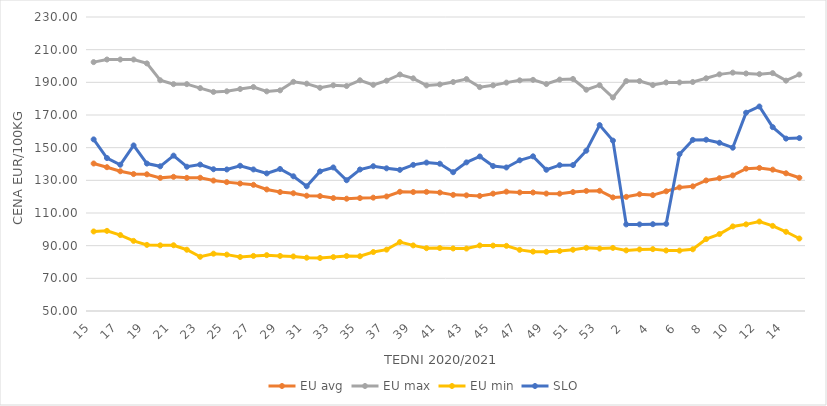
| Category | EU avg | EU max | EU min | SLO |
|---|---|---|---|---|
| 15.0 | 140.306 | 202.38 | 98.696 | 155.07 |
| 16.0 | 138.046 | 203.97 | 99.065 | 143.65 |
| 17.0 | 135.556 | 203.97 | 96.499 | 139.55 |
| 18.0 | 133.857 | 203.97 | 92.931 | 151.36 |
| 19.0 | 133.702 | 201.59 | 90.48 | 140.27 |
| 20.0 | 131.51 | 191.27 | 90.199 | 138.59 |
| 21.0 | 132.157 | 188.89 | 90.255 | 145.12 |
| 22.0 | 131.509 | 188.89 | 87.513 | 138.33 |
| 23.0 | 131.578 | 186.47 | 83.199 | 139.64 |
| 24.0 | 129.861 | 184.13 | 85.09 | 136.79 |
| 25.0 | 128.899 | 184.51 | 84.52 | 136.65 |
| 26.0 | 128.034 | 185.91 | 83.06 | 138.92 |
| 27.0 | 127.242 | 187.11 | 83.73 | 136.67 |
| 28.0 | 124.426 | 184.46 | 84.2 | 134.25 |
| 29.0 | 122.822 | 185.09 | 83.72 | 136.94 |
| 30.0 | 122.086 | 190.31 | 83.4 | 132.48 |
| 31.0 | 120.581 | 189.19 | 82.63 | 126.34 |
| 32.0 | 120.341 | 186.67 | 82.46 | 135.48 |
| 33.0 | 119.127 | 188.18 | 82.99 | 137.89 |
| 34.0 | 118.75 | 187.74 | 83.66 | 130.07 |
| 35.0 | 119.136 | 191.25 | 83.53 | 136.63 |
| 36.0 | 119.398 | 188.47 | 86.09 | 138.64 |
| 37.0 | 120.135 | 190.99 | 87.57 | 137.35 |
| 38.0 | 122.982 | 194.8 | 92.21 | 136.42 |
| 39.0 | 122.832 | 192.45 | 90.16 | 139.46 |
| 40.0 | 122.936 | 188.11 | 88.45 | 140.87 |
| 41.0 | 122.507 | 188.73 | 88.54 | 140.18 |
| 42.0 | 121.098 | 190.2 | 88.3 | 134.98 |
| 43.0 | 120.822 | 191.99 | 88.22 | 141 |
| 44.0 | 120.448 | 187.06 | 90.13 | 144.61 |
| 45.0 | 121.843 | 188.15 | 90.04 | 138.73 |
| 46.0 | 123.07 | 189.82 | 89.89 | 137.88 |
| 47.0 | 122.58 | 191.22 | 87.43 | 142.27 |
| 48.0 | 122.553 | 191.52 | 86.35 | 144.69 |
| 49.0 | 121.893 | 188.97 | 86.24 | 136.47 |
| 50.0 | 121.851 | 191.67 | 86.72 | 139.29 |
| 51.0 | 122.8 | 192.06 | 87.5 | 139.35 |
| 52.0 | 123.52 | 185.468 | 88.67 | 148.16 |
| 53.0 | 123.611 | 188.25 | 88.23 | 163.81 |
| 1.0 | 119.553 | 180.72 | 88.64 | 154.31 |
| 2.0 | 119.893 | 190.77 | 87.1 | 103.02 |
| 3.0 | 121.489 | 190.76 | 87.7 | 103.03 |
| 4.0 | 120.954 | 188.33 | 87.88 | 103.15 |
| 5.0 | 123.293 | 189.91 | 87.04 | 103.34 |
| 6.0 | 125.679 | 189.94 | 86.97 | 146.03 |
| 7.0 | 126.326 | 190.21 | 87.79 | 154.77 |
| 8.0 | 129.933 | 192.48 | 94.02 | 154.86 |
| 9.0 | 131.295 | 194.884 | 97.12 | 153 |
| 10.0 | 133.026 | 195.94 | 101.79 | 149.98 |
| 11.0 | 137.152 | 195.419 | 103.05 | 171.4 |
| 12.0 | 137.599 | 195.013 | 104.76 | 175.2 |
| 13.0 | 136.546 | 195.64 | 102.11 | 162.57 |
| 14.0 | 134.308 | 191.034 | 98.5 | 155.55 |
| 15.0 | 131.575 | 194.79 | 94.39 | 155.88 |